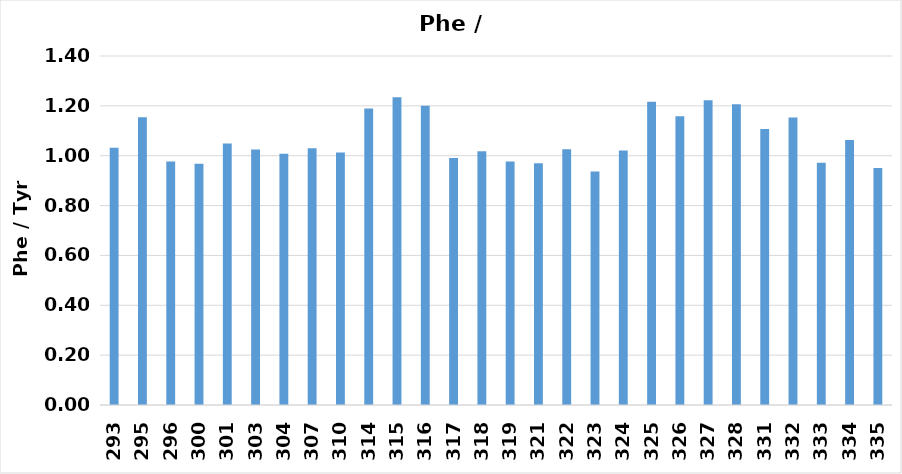
| Category | Series 0 |
|---|---|
| 293.0 | 1.032 |
| 295.0 | 1.154 |
| 296.0 | 0.976 |
| 300.0 | 0.968 |
| 301.0 | 1.049 |
| 303.0 | 1.025 |
| 304.0 | 1.008 |
| 307.0 | 1.03 |
| 310.0 | 1.012 |
| 314.0 | 1.19 |
| 315.0 | 1.235 |
| 316.0 | 1.2 |
| 317.0 | 0.991 |
| 318.0 | 1.018 |
| 319.0 | 0.977 |
| 321.0 | 0.97 |
| 322.0 | 1.026 |
| 323.0 | 0.936 |
| 324.0 | 1.021 |
| 325.0 | 1.217 |
| 326.0 | 1.159 |
| 327.0 | 1.223 |
| 328.0 | 1.206 |
| 331.0 | 1.107 |
| 332.0 | 1.154 |
| 333.0 | 0.972 |
| 334.0 | 1.063 |
| 335.0 | 0.951 |